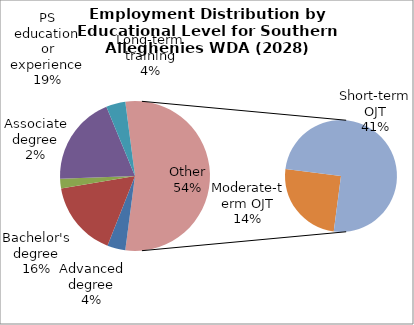
| Category | Series 0 |
|---|---|
| Advanced degree | 7410 |
| Bachelor's degree | 30900 |
| Associate degree | 4000 |
| PS education or experience | 36620 |
| Long-term training | 7870 |
| Moderate-term OJT | 25570 |
| Short-term OJT | 76920 |